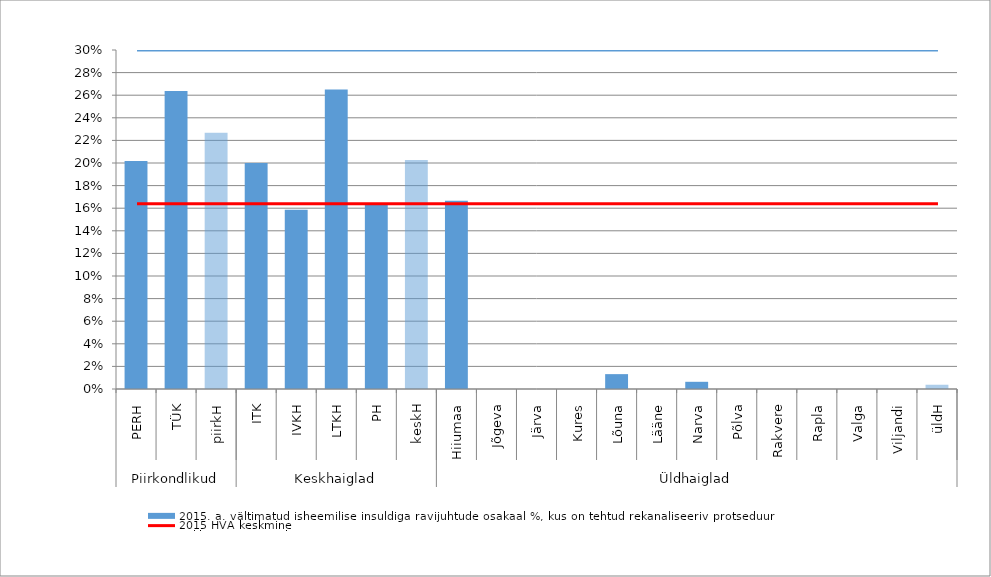
| Category | 2015. a. vältimatud isheemilise insuldiga ravijuhtude osakaal %, kus on tehtud rekanaliseeriv protseduur |
|---|---|
| 0 | 0.202 |
| 1 | 0.264 |
| 2 | 0.227 |
| 3 | 0.2 |
| 4 | 0.159 |
| 5 | 0.265 |
| 6 | 0.163 |
| 7 | 0.203 |
| 8 | 0.167 |
| 9 | 0 |
| 10 | 0 |
| 11 | 0 |
| 12 | 0.013 |
| 13 | 0 |
| 14 | 0.006 |
| 15 | 0 |
| 16 | 0 |
| 17 | 0 |
| 18 | 0 |
| 19 | 0 |
| 20 | 0.004 |